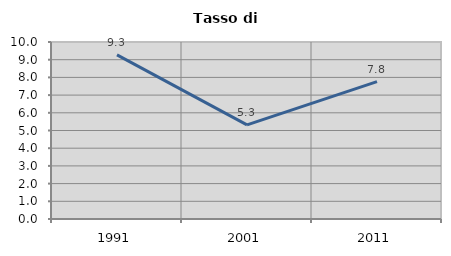
| Category | Tasso di disoccupazione   |
|---|---|
| 1991.0 | 9.27 |
| 2001.0 | 5.316 |
| 2011.0 | 7.759 |